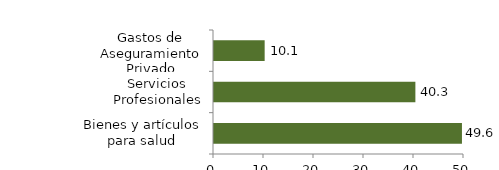
| Category | Salud |
|---|---|
| Bienes y artículos para salud | 49.59 |
| Servicios Profesionales | 40.277 |
| Gastos de Aseguramiento Privado | 10.133 |